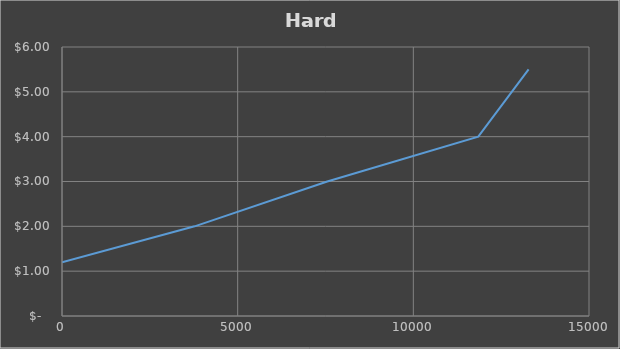
| Category | Series 0 |
|---|---|
| 0.0 | 1.2 |
| 3775.0 | 2 |
| 7550.0 | 3 |
| 11848.25 | 4 |
| 13281.0 | 5.5 |